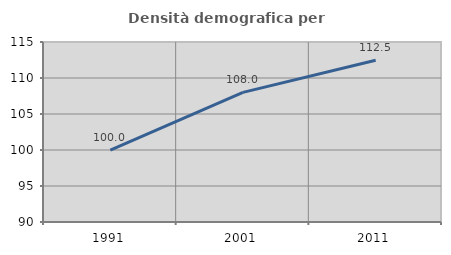
| Category | Densità demografica |
|---|---|
| 1991.0 | 99.974 |
| 2001.0 | 108.002 |
| 2011.0 | 112.471 |